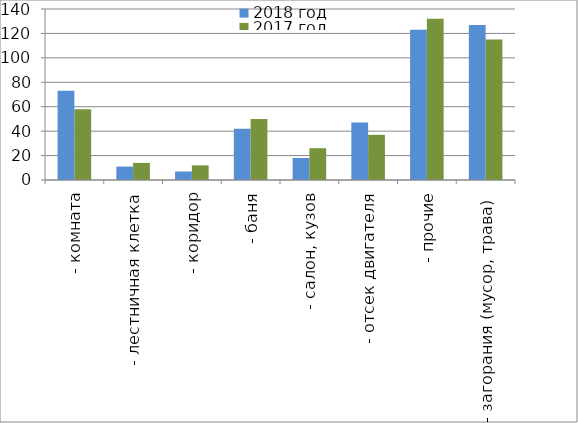
| Category | 2018 год | 2017 год |
|---|---|---|
|  - комната | 73 | 58 |
|  - лестничная клетка | 11 | 14 |
|  - коридор | 7 | 12 |
|  - баня | 42 | 50 |
|  - салон, кузов | 18 | 26 |
|  - отсек двигателя | 47 | 37 |
| - прочие | 123 | 132 |
| - загорания (мусор, трава)  | 127 | 115 |